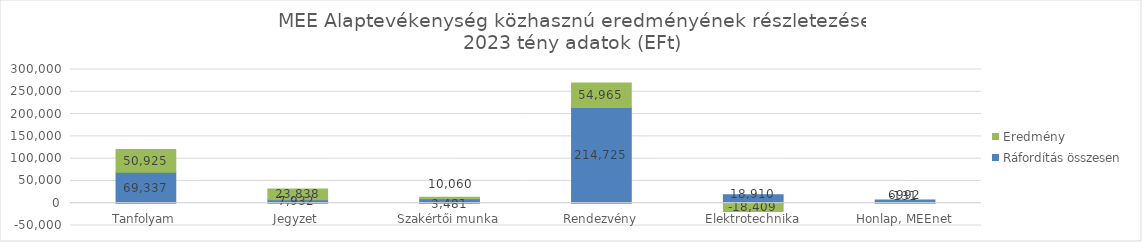
| Category | Ráfordítás összesen | Eredmény |
|---|---|---|
| Tanfolyam | 69336.612 | 50925.314 |
| Jegyzet | 7932.165 | 23837.724 |
| Szakértői munka | 10060 | 3481 |
| Rendezvény | 214725 | 54965.211 |
| Elektrotechnika | 18910 | -18408.8 |
| Honlap, MEEnet | 6992.171 | -131.131 |